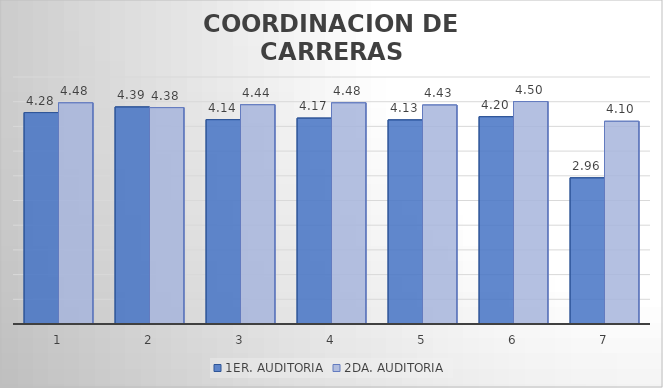
| Category | 1ER. AUDITORIA | 2DA. AUDITORIA |
|---|---|---|
| 0 | 4.28 | 4.477 |
| 1 | 4.393 | 4.381 |
| 2 | 4.137 | 4.439 |
| 3 | 4.167 | 4.477 |
| 4 | 4.131 | 4.432 |
| 5 | 4.196 | 4.503 |
| 6 | 2.958 | 4.103 |